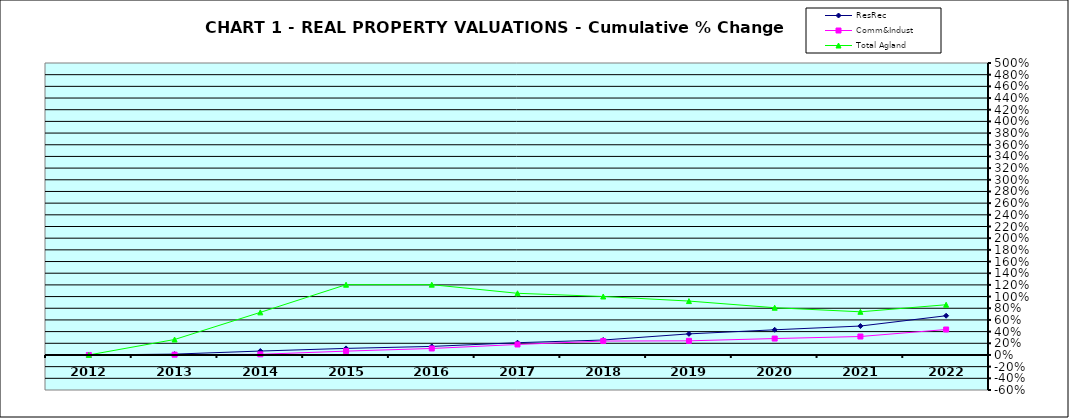
| Category | ResRec | Comm&Indust | Total Agland |
|---|---|---|---|
| 2012.0 | 0 | 0 | 0 |
| 2013.0 | 0.014 | 0.005 | 0.265 |
| 2014.0 | 0.067 | 0.011 | 0.729 |
| 2015.0 | 0.113 | 0.066 | 1.203 |
| 2016.0 | 0.146 | 0.111 | 1.204 |
| 2017.0 | 0.21 | 0.18 | 1.056 |
| 2018.0 | 0.256 | 0.238 | 1.001 |
| 2019.0 | 0.361 | 0.242 | 0.923 |
| 2020.0 | 0.431 | 0.281 | 0.809 |
| 2021.0 | 0.495 | 0.316 | 0.739 |
| 2022.0 | 0.672 | 0.436 | 0.86 |